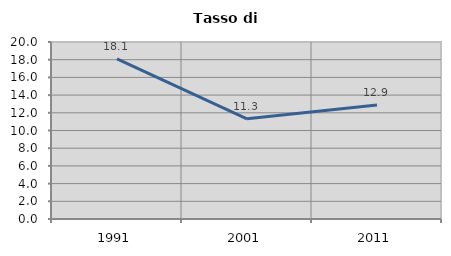
| Category | Tasso di disoccupazione   |
|---|---|
| 1991.0 | 18.096 |
| 2001.0 | 11.317 |
| 2011.0 | 12.883 |